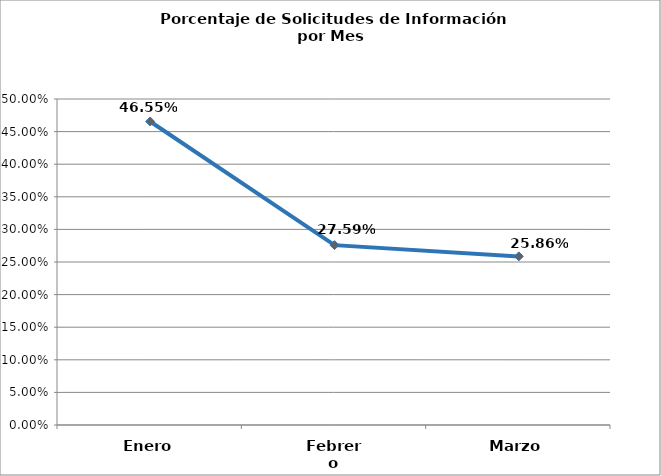
| Category | Series 0 |
|---|---|
| Enero | 0.466 |
| Febrero | 0.276 |
| Marzo | 0.259 |